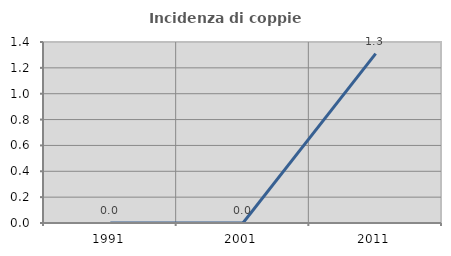
| Category | Incidenza di coppie miste |
|---|---|
| 1991.0 | 0 |
| 2001.0 | 0 |
| 2011.0 | 1.31 |